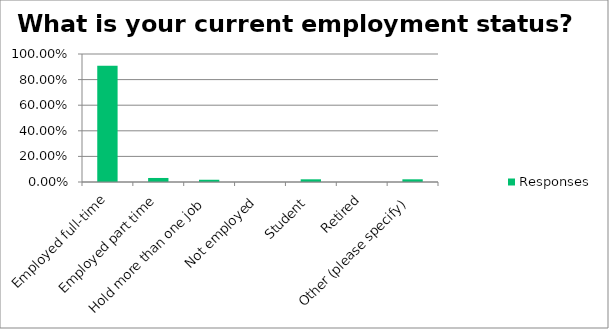
| Category | Responses |
|---|---|
| Employed full-time | 0.909 |
| Employed part time | 0.032 |
| Hold more than one job | 0.018 |
| Not employed | 0 |
| Student | 0.021 |
| Retired | 0 |
| Other (please specify) | 0.021 |